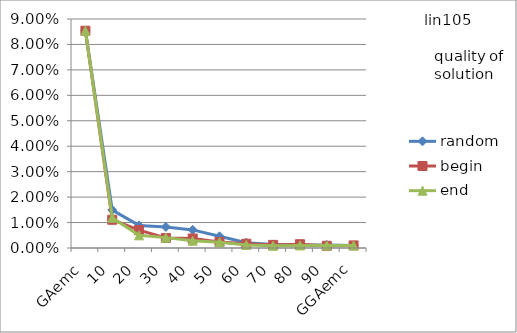
| Category | random | begin | end |
|---|---|---|---|
| 0 | 0.085 | 0.085 | 0.085 |
| 1 | 0.015 | 0.011 | 0.012 |
| 2 | 0.009 | 0.007 | 0.005 |
| 3 | 0.008 | 0.004 | 0.004 |
| 4 | 0.007 | 0.004 | 0.003 |
| 5 | 0.005 | 0.002 | 0.002 |
| 6 | 0.002 | 0.002 | 0.001 |
| 7 | 0.001 | 0.001 | 0.001 |
| 8 | 0.001 | 0.001 | 0.001 |
| 9 | 0.001 | 0.001 | 0.001 |
| 10 | 0.001 | 0.001 | 0.001 |